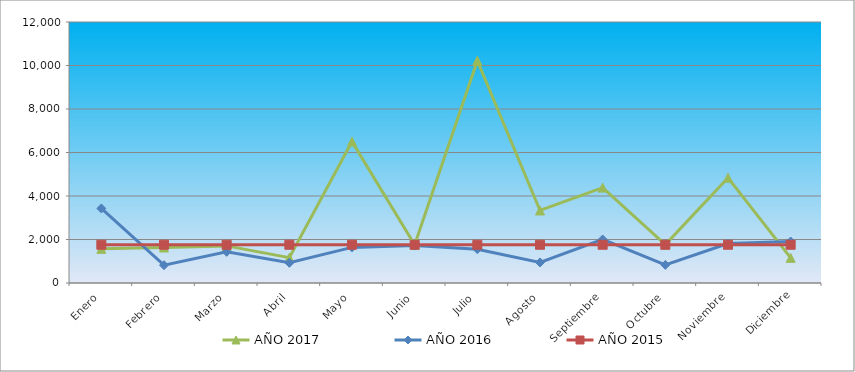
| Category | AÑO 2017 | AÑO 2016 | AÑO 2015 |
|---|---|---|---|
| Enero | 1570.599 | 3428.432 | 1757.945 |
| Febrero | 1632.191 | 818.683 | 1757.945 |
| Marzo | 1706.102 | 1432.695 | 1757.945 |
| Abril | 1165.091 | 927.414 | 1757.945 |
| Mayo | 6500.501 | 1637.365 | 1757.945 |
| Junio | 1755.376 | 1720.513 | 1757.945 |
| Julio | 10220.78 | 1554.218 | 1757.945 |
| Agosto | 3335.097 | 946.602 | 1757.945 |
| Septiembre | 4385.068 | 2001.935 | 1757.945 |
| Octubre | 1767.694 | 831.475 | 1757.945 |
| Noviembre | 4840.152 | 1816.452 | 1757.945 |
| Diciembre | 1157.932 | 1905.996 | 1757.945 |